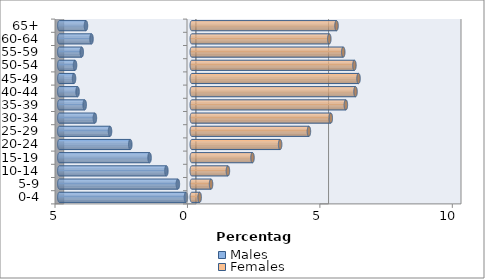
| Category | Males | Females |
|---|---|---|
| 0-4 | -0.22 | 0.297 |
| 5-9 | -0.525 | 0.728 |
| 10-14 | -0.958 | 1.364 |
| 15-19 | -1.593 | 2.292 |
| 20-24 | -2.321 | 3.336 |
| 25-29 | -3.086 | 4.422 |
| 30-34 | -3.658 | 5.248 |
| 35-39 | -4.043 | 5.817 |
| 40-44 | -4.311 | 6.182 |
| 45-49 | -4.445 | 6.295 |
| 50-54 | -4.408 | 6.14 |
| 55-59 | -4.154 | 5.718 |
| 60-64 | -3.785 | 5.192 |
| 65+ | -3.995 | 5.465 |